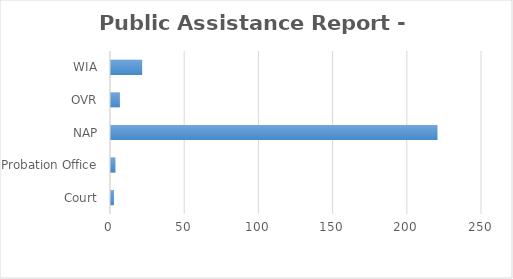
| Category | Series 0 |
|---|---|
| Court | 2 |
| Probation Office | 3 |
| NAP | 220 |
| OVR | 6 |
| WIA | 21 |